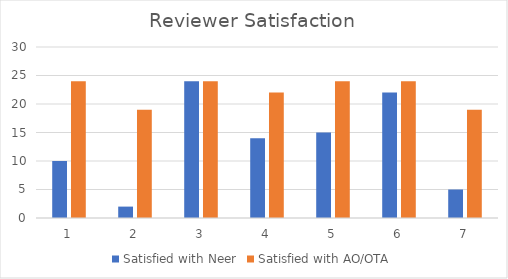
| Category | Satisfied with Neer | Satisfied with AO/OTA |
|---|---|---|
| 0 | 10 | 24 |
| 1 | 2 | 19 |
| 2 | 24 | 24 |
| 3 | 14 | 22 |
| 4 | 15 | 24 |
| 5 | 22 | 24 |
| 6 | 5 | 19 |